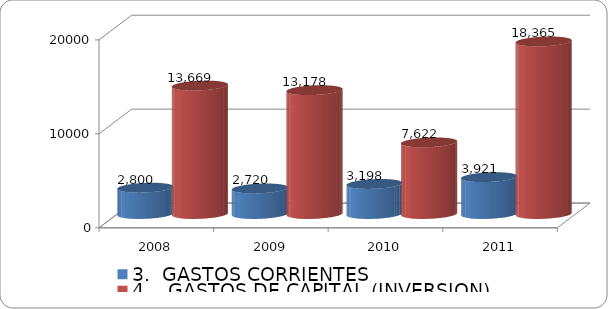
| Category | 3.  GASTOS CORRIENTES | 4.   GASTOS DE CAPITAL (INVERSION) |
|---|---|---|
| 2008.0 | 2800.027 | 13668.913 |
| 2009.0 | 2720.458 | 13178.152 |
| 2010.0 | 3197.838 | 7622.05 |
| 2011.0 | 3921 | 18365 |